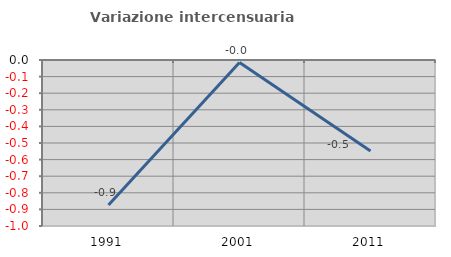
| Category | Variazione intercensuaria annua |
|---|---|
| 1991.0 | -0.874 |
| 2001.0 | -0.015 |
| 2011.0 | -0.548 |